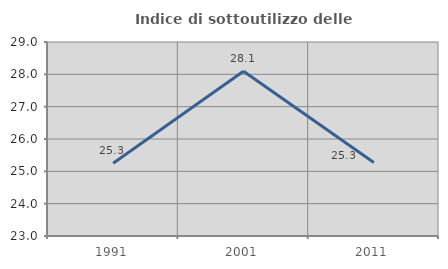
| Category | Indice di sottoutilizzo delle abitazioni  |
|---|---|
| 1991.0 | 25.252 |
| 2001.0 | 28.092 |
| 2011.0 | 25.272 |